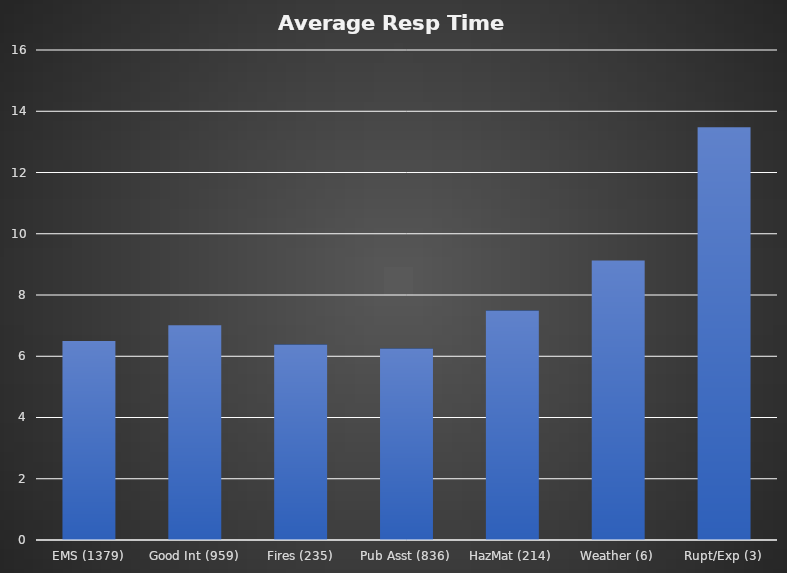
| Category | Average Resp Time 07:49 |
|---|---|
| EMS (1379) | 6.5 |
| Good Int (959) | 7.01 |
| Fires (235) | 6.38 |
| Pub Asst (836) | 6.25 |
| HazMat (214) | 7.49 |
| Weather (6) | 9.13 |
| Rupt/Exp (3) | 13.48 |